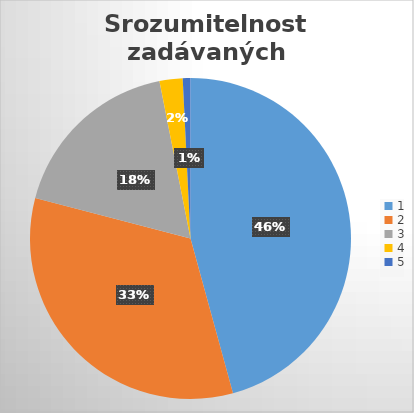
| Category | Series 0 |
|---|---|
| 0 | 59 |
| 1 | 43 |
| 2 | 23 |
| 3 | 3 |
| 4 | 1 |